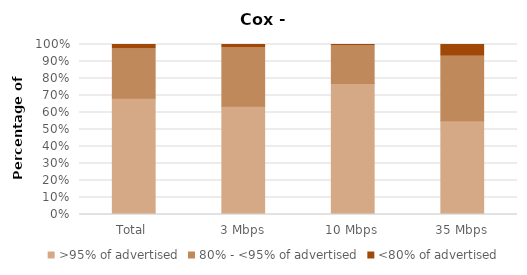
| Category | >95% of advertised | 80% - <95% of advertised | <80% of advertised |
|---|---|---|---|
| Total | 0.684 | 0.29 | 0.026 |
| 3 Mbps | 0.636 | 0.345 | 0.018 |
| 10 Mbps | 0.771 | 0.22 | 0.008 |
| 35 Mbps | 0.552 | 0.379 | 0.069 |